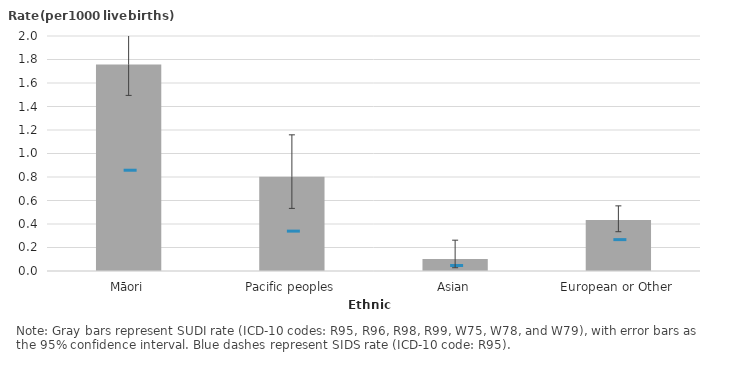
| Category | SUDI |
|---|---|
| Māori | 1.757 |
| Pacific peoples | 0.802 |
| Asian | 0.102 |
| European or Other | 0.434 |